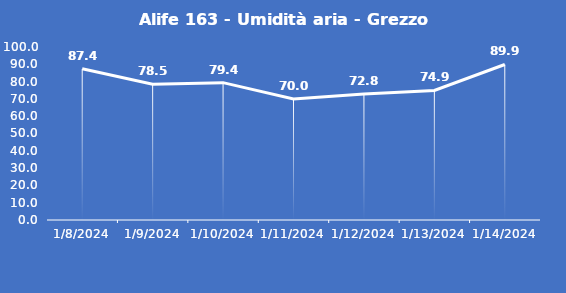
| Category | Alife 163 - Umidità aria - Grezzo (%) |
|---|---|
| 1/8/24 | 87.4 |
| 1/9/24 | 78.5 |
| 1/10/24 | 79.4 |
| 1/11/24 | 70 |
| 1/12/24 | 72.8 |
| 1/13/24 | 74.9 |
| 1/14/24 | 89.9 |